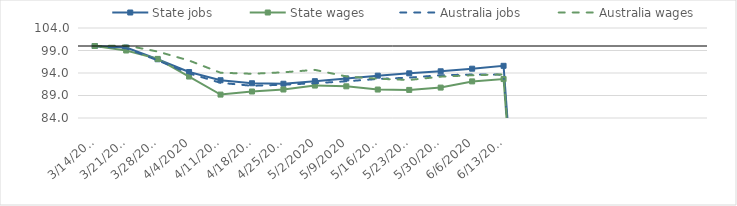
| Category | State jobs | State wages | Australia jobs | Australia wages |
|---|---|---|---|---|
| 14/03/2020 | 100 | 100 | 100 | 100 |
| 21/03/2020 | 99.657 | 98.998 | 99.495 | 100.113 |
| 28/03/2020 | 97.055 | 97.136 | 96.817 | 98.771 |
| 04/04/2020 | 94.213 | 93.214 | 93.908 | 96.774 |
| 11/04/2020 | 92.39 | 89.203 | 91.822 | 94.06 |
| 18/04/2020 | 91.72 | 89.886 | 91.153 | 93.831 |
| 25/04/2020 | 91.612 | 90.333 | 91.399 | 94.154 |
| 02/05/2020 | 92.181 | 91.205 | 91.732 | 94.697 |
| 09/05/2020 | 92.786 | 91.039 | 92.161 | 93.23 |
| 16/05/2020 | 93.411 | 90.325 | 92.673 | 92.722 |
| 23/05/2020 | 93.929 | 90.24 | 92.969 | 92.453 |
| 30/05/2020 | 94.38 | 90.757 | 93.509 | 93.187 |
| 06/06/2020 | 94.956 | 92.134 | 93.654 | 93.503 |
| 13/06/2020 | 95.596 | 92.656 | 93.635 | 93.681 |